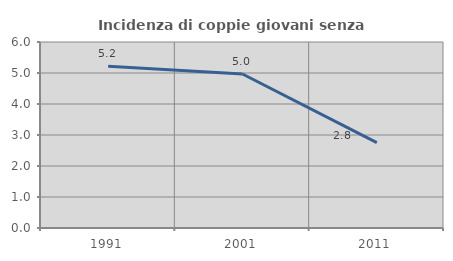
| Category | Incidenza di coppie giovani senza figli |
|---|---|
| 1991.0 | 5.215 |
| 2001.0 | 4.969 |
| 2011.0 | 2.755 |